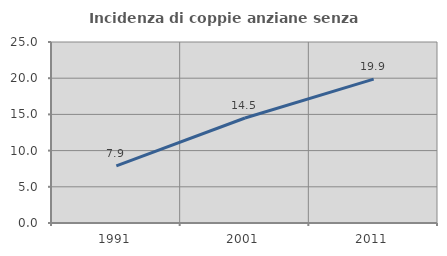
| Category | Incidenza di coppie anziane senza figli  |
|---|---|
| 1991.0 | 7.879 |
| 2001.0 | 14.505 |
| 2011.0 | 19.874 |